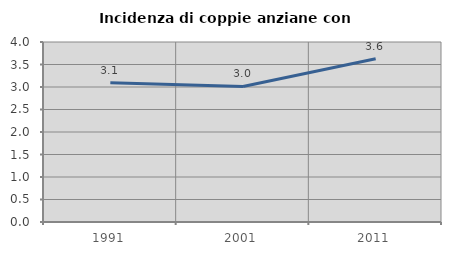
| Category | Incidenza di coppie anziane con figli |
|---|---|
| 1991.0 | 3.095 |
| 2001.0 | 3.012 |
| 2011.0 | 3.627 |